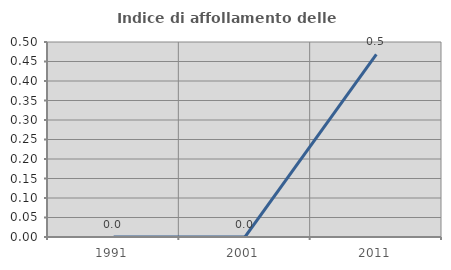
| Category | Indice di affollamento delle abitazioni  |
|---|---|
| 1991.0 | 0 |
| 2001.0 | 0 |
| 2011.0 | 0.468 |